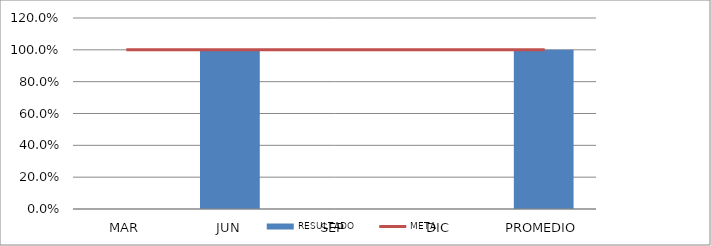
| Category | RESULTADO |
|---|---|
| MAR | 0 |
| JUN | 1 |
| SEP | 0 |
| DIC | 0 |
| PROMEDIO | 1 |